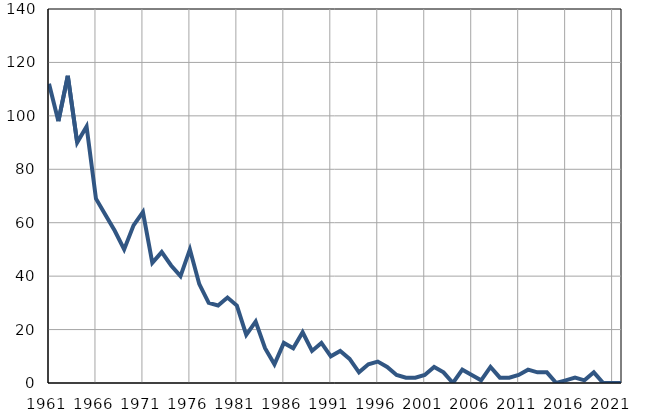
| Category | Умрла 
одојчад |
|---|---|
| 1961.0 | 112 |
| 1962.0 | 98 |
| 1963.0 | 115 |
| 1964.0 | 90 |
| 1965.0 | 96 |
| 1966.0 | 69 |
| 1967.0 | 63 |
| 1968.0 | 57 |
| 1969.0 | 50 |
| 1970.0 | 59 |
| 1971.0 | 64 |
| 1972.0 | 45 |
| 1973.0 | 49 |
| 1974.0 | 44 |
| 1975.0 | 40 |
| 1976.0 | 50 |
| 1977.0 | 37 |
| 1978.0 | 30 |
| 1979.0 | 29 |
| 1980.0 | 32 |
| 1981.0 | 29 |
| 1982.0 | 18 |
| 1983.0 | 23 |
| 1984.0 | 13 |
| 1985.0 | 7 |
| 1986.0 | 15 |
| 1987.0 | 13 |
| 1988.0 | 19 |
| 1989.0 | 12 |
| 1990.0 | 15 |
| 1991.0 | 10 |
| 1992.0 | 12 |
| 1993.0 | 9 |
| 1994.0 | 4 |
| 1995.0 | 7 |
| 1996.0 | 8 |
| 1997.0 | 6 |
| 1998.0 | 3 |
| 1999.0 | 2 |
| 2000.0 | 2 |
| 2001.0 | 3 |
| 2002.0 | 6 |
| 2003.0 | 4 |
| 2004.0 | 0 |
| 2005.0 | 5 |
| 2006.0 | 3 |
| 2007.0 | 1 |
| 2008.0 | 6 |
| 2009.0 | 2 |
| 2010.0 | 2 |
| 2011.0 | 3 |
| 2012.0 | 5 |
| 2013.0 | 4 |
| 2014.0 | 4 |
| 2015.0 | 0 |
| 2016.0 | 1 |
| 2017.0 | 2 |
| 2018.0 | 1 |
| 2019.0 | 4 |
| 2020.0 | 0 |
| 2021.0 | 0 |
| 2022.0 | 0 |